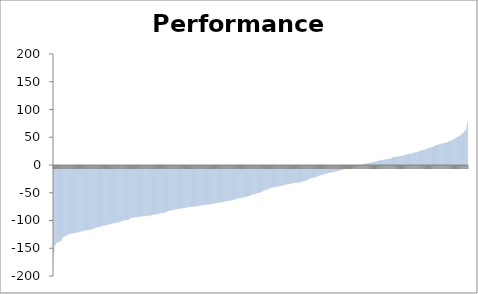
| Category | Series 0 |
|---|---|
| 0 | -168.15 |
| 1 | -160.46 |
| 2 | -155.47 |
| 3 | -143.4 |
| 4 | -143.14 |
| 5 | -141.38 |
| 6 | -139.07 |
| 7 | -138.73 |
| 8 | -138.63 |
| 9 | -137.36 |
| 10 | -137.06 |
| 11 | -136.82 |
| 12 | -136.69 |
| 13 | -136.4 |
| 14 | -136 |
| 15 | -135.44 |
| 16 | -135.12 |
| 17 | -134.83 |
| 18 | -132.09 |
| 19 | -130.36 |
| 20 | -128.58 |
| 21 | -127.94 |
| 22 | -127.71 |
| 23 | -126.86 |
| 24 | -126.47 |
| 25 | -126.25 |
| 26 | -126.04 |
| 27 | -126.02 |
| 28 | -125.87 |
| 29 | -124.94 |
| 30 | -124.08 |
| 31 | -123.94 |
| 32 | -123.57 |
| 33 | -123.02 |
| 34 | -122.91 |
| 35 | -122.63 |
| 36 | -122.16 |
| 37 | -121.8 |
| 38 | -121.59 |
| 39 | -121.44 |
| 40 | -121.37 |
| 41 | -121.22 |
| 42 | -121.2 |
| 43 | -120.97 |
| 44 | -120.97 |
| 45 | -120.63 |
| 46 | -120.4 |
| 47 | -120.26 |
| 48 | -120.23 |
| 49 | -120.15 |
| 50 | -120.1 |
| 51 | -119.71 |
| 52 | -119.6 |
| 53 | -119.43 |
| 54 | -118.8 |
| 55 | -118.68 |
| 56 | -118.65 |
| 57 | -118.44 |
| 58 | -117.842 |
| 59 | -117.803 |
| 60 | -117.276 |
| 61 | -117.073 |
| 62 | -116.786 |
| 63 | -116.783 |
| 64 | -116.707 |
| 65 | -116.63 |
| 66 | -116.42 |
| 67 | -116.2 |
| 68 | -115.933 |
| 69 | -115.901 |
| 70 | -115.684 |
| 71 | -115.58 |
| 72 | -115.505 |
| 73 | -115.445 |
| 74 | -115.298 |
| 75 | -115.17 |
| 76 | -115.164 |
| 77 | -115.008 |
| 78 | -114.646 |
| 79 | -114.292 |
| 80 | -113.9 |
| 81 | -113.631 |
| 82 | -113.506 |
| 83 | -113.43 |
| 84 | -113.367 |
| 85 | -112.374 |
| 86 | -112.258 |
| 87 | -111.667 |
| 88 | -111.441 |
| 89 | -111.295 |
| 90 | -110.928 |
| 91 | -110.468 |
| 92 | -110.248 |
| 93 | -109.985 |
| 94 | -109.842 |
| 95 | -109.805 |
| 96 | -109.729 |
| 97 | -109.666 |
| 98 | -109.417 |
| 99 | -109.144 |
| 100 | -109.133 |
| 101 | -108.337 |
| 102 | -108.227 |
| 103 | -107.854 |
| 104 | -107.708 |
| 105 | -107.654 |
| 106 | -107.433 |
| 107 | -107.264 |
| 108 | -107.154 |
| 109 | -107.019 |
| 110 | -106.724 |
| 111 | -106.695 |
| 112 | -106.487 |
| 113 | -106.293 |
| 114 | -106.106 |
| 115 | -105.837 |
| 116 | -105.499 |
| 117 | -105.41 |
| 118 | -104.634 |
| 119 | -104.589 |
| 120 | -104.248 |
| 121 | -103.812 |
| 122 | -103.695 |
| 123 | -103.661 |
| 124 | -103.56 |
| 125 | -103.149 |
| 126 | -103.015 |
| 127 | -102.837 |
| 128 | -102.768 |
| 129 | -102.489 |
| 130 | -102.411 |
| 131 | -102.207 |
| 132 | -102.129 |
| 133 | -101.96 |
| 134 | -101.728 |
| 135 | -101.667 |
| 136 | -101.62 |
| 137 | -101.399 |
| 138 | -101.102 |
| 139 | -100.771 |
| 140 | -100.026 |
| 141 | -99.728 |
| 142 | -99.296 |
| 143 | -98.812 |
| 144 | -98.296 |
| 145 | -98.181 |
| 146 | -98.106 |
| 147 | -98.096 |
| 148 | -97.937 |
| 149 | -97.617 |
| 150 | -97.559 |
| 151 | -97.526 |
| 152 | -97.494 |
| 153 | -97.491 |
| 154 | -97.384 |
| 155 | -97.214 |
| 156 | -96.724 |
| 157 | -96.627 |
| 158 | -95.519 |
| 159 | -95.359 |
| 160 | -94.016 |
| 161 | -94.006 |
| 162 | -93.853 |
| 163 | -93.569 |
| 164 | -93.518 |
| 165 | -93.495 |
| 166 | -93.329 |
| 167 | -93.256 |
| 168 | -92.522 |
| 169 | -92.416 |
| 170 | -92.293 |
| 171 | -92.244 |
| 172 | -92.238 |
| 173 | -92.218 |
| 174 | -92.201 |
| 175 | -92.141 |
| 176 | -91.907 |
| 177 | -91.823 |
| 178 | -91.556 |
| 179 | -91.353 |
| 180 | -91.072 |
| 181 | -91.043 |
| 182 | -90.926 |
| 183 | -90.847 |
| 184 | -90.778 |
| 185 | -90.748 |
| 186 | -90.663 |
| 187 | -90.654 |
| 188 | -90.622 |
| 189 | -90.59 |
| 190 | -90.543 |
| 191 | -90.508 |
| 192 | -90.424 |
| 193 | -90.404 |
| 194 | -90.042 |
| 195 | -90.012 |
| 196 | -90.002 |
| 197 | -89.979 |
| 198 | -89.745 |
| 199 | -89.364 |
| 200 | -89.326 |
| 201 | -89.305 |
| 202 | -89.022 |
| 203 | -88.984 |
| 204 | -88.694 |
| 205 | -88.381 |
| 206 | -88.224 |
| 207 | -87.525 |
| 208 | -87.445 |
| 209 | -87.319 |
| 210 | -87.305 |
| 211 | -87.276 |
| 212 | -87.248 |
| 213 | -86.999 |
| 214 | -86.818 |
| 215 | -86.799 |
| 216 | -86.791 |
| 217 | -86.336 |
| 218 | -86.166 |
| 219 | -86.036 |
| 220 | -85.829 |
| 221 | -85.639 |
| 222 | -85.143 |
| 223 | -85.008 |
| 224 | -84.954 |
| 225 | -84.91 |
| 226 | -84.842 |
| 227 | -84.477 |
| 228 | -84.025 |
| 229 | -84.009 |
| 230 | -84.005 |
| 231 | -83.899 |
| 232 | -83.589 |
| 233 | -83.37 |
| 234 | -83.349 |
| 235 | -82.879 |
| 236 | -82.656 |
| 237 | -81.383 |
| 238 | -80.962 |
| 239 | -80.958 |
| 240 | -80.918 |
| 241 | -80.805 |
| 242 | -80.318 |
| 243 | -80.21 |
| 244 | -80.174 |
| 245 | -79.957 |
| 246 | -79.953 |
| 247 | -79.624 |
| 248 | -79.408 |
| 249 | -79.187 |
| 250 | -78.904 |
| 251 | -78.765 |
| 252 | -78.404 |
| 253 | -77.974 |
| 254 | -77.812 |
| 255 | -77.729 |
| 256 | -77.718 |
| 257 | -77.644 |
| 258 | -77.555 |
| 259 | -77.455 |
| 260 | -76.984 |
| 261 | -76.866 |
| 262 | -76.842 |
| 263 | -76.786 |
| 264 | -76.711 |
| 265 | -76.7 |
| 266 | -76.465 |
| 267 | -76.403 |
| 268 | -76.349 |
| 269 | -76.255 |
| 270 | -76.252 |
| 271 | -75.987 |
| 272 | -75.934 |
| 273 | -75.67 |
| 274 | -75.504 |
| 275 | -75.433 |
| 276 | -75.36 |
| 277 | -75.256 |
| 278 | -74.908 |
| 279 | -74.374 |
| 280 | -74.099 |
| 281 | -73.893 |
| 282 | -73.717 |
| 283 | -73.631 |
| 284 | -73.575 |
| 285 | -73.498 |
| 286 | -73.434 |
| 287 | -73.417 |
| 288 | -73.36 |
| 289 | -73.347 |
| 290 | -73.332 |
| 291 | -73.286 |
| 292 | -73.123 |
| 293 | -73.039 |
| 294 | -72.846 |
| 295 | -72.772 |
| 296 | -72.755 |
| 297 | -72.58 |
| 298 | -72.471 |
| 299 | -72.366 |
| 300 | -72.245 |
| 301 | -72.019 |
| 302 | -71.576 |
| 303 | -71.508 |
| 304 | -71.374 |
| 305 | -71.171 |
| 306 | -71.114 |
| 307 | -71.032 |
| 308 | -70.968 |
| 309 | -70.796 |
| 310 | -70.629 |
| 311 | -70.524 |
| 312 | -70.484 |
| 313 | -70.482 |
| 314 | -70.36 |
| 315 | -70.227 |
| 316 | -70.157 |
| 317 | -69.881 |
| 318 | -69.85 |
| 319 | -69.531 |
| 320 | -69.518 |
| 321 | -69.484 |
| 322 | -69.407 |
| 323 | -69.276 |
| 324 | -69.242 |
| 325 | -69.117 |
| 326 | -68.779 |
| 327 | -68.749 |
| 328 | -68.597 |
| 329 | -68.329 |
| 330 | -68.271 |
| 331 | -67.921 |
| 332 | -67.793 |
| 333 | -67.651 |
| 334 | -67.558 |
| 335 | -67.539 |
| 336 | -67.178 |
| 337 | -67.095 |
| 338 | -66.779 |
| 339 | -66.712 |
| 340 | -66.606 |
| 341 | -66.592 |
| 342 | -66.585 |
| 343 | -66.553 |
| 344 | -66.087 |
| 345 | -65.893 |
| 346 | -65.796 |
| 347 | -65.467 |
| 348 | -65.458 |
| 349 | -65.418 |
| 350 | -65.367 |
| 351 | -65.124 |
| 352 | -65.065 |
| 353 | -64.886 |
| 354 | -64.738 |
| 355 | -64.606 |
| 356 | -63.924 |
| 357 | -63.849 |
| 358 | -63.397 |
| 359 | -63.308 |
| 360 | -63.237 |
| 361 | -63.177 |
| 362 | -63.043 |
| 363 | -63.033 |
| 364 | -62.997 |
| 365 | -62.778 |
| 366 | -62.631 |
| 367 | -62.579 |
| 368 | -62.092 |
| 369 | -61.978 |
| 370 | -61.911 |
| 371 | -61.589 |
| 372 | -61.292 |
| 373 | -61.099 |
| 374 | -60.92 |
| 375 | -60.825 |
| 376 | -60.333 |
| 377 | -60.063 |
| 378 | -60.045 |
| 379 | -59.465 |
| 380 | -59.254 |
| 381 | -59.107 |
| 382 | -59.046 |
| 383 | -59.011 |
| 384 | -58.656 |
| 385 | -58.201 |
| 386 | -57.795 |
| 387 | -57.795 |
| 388 | -57.7 |
| 389 | -57.683 |
| 390 | -57.441 |
| 391 | -57.266 |
| 392 | -56.864 |
| 393 | -56.656 |
| 394 | -56.57 |
| 395 | -56.389 |
| 396 | -56.377 |
| 397 | -56.099 |
| 398 | -55.764 |
| 399 | -55.722 |
| 400 | -55.631 |
| 401 | -55.245 |
| 402 | -55.178 |
| 403 | -55.085 |
| 404 | -54.661 |
| 405 | -54.572 |
| 406 | -54.012 |
| 407 | -53.901 |
| 408 | -53.774 |
| 409 | -53.722 |
| 410 | -53.373 |
| 411 | -52.747 |
| 412 | -52.303 |
| 413 | -51.901 |
| 414 | -51.386 |
| 415 | -51.322 |
| 416 | -51.166 |
| 417 | -51.136 |
| 418 | -51.028 |
| 419 | -50.97 |
| 420 | -50.113 |
| 421 | -49.487 |
| 422 | -49.386 |
| 423 | -49.212 |
| 424 | -49.136 |
| 425 | -48.842 |
| 426 | -48.84 |
| 427 | -48.71 |
| 428 | -48.376 |
| 429 | -47.731 |
| 430 | -47.526 |
| 431 | -47.245 |
| 432 | -46.739 |
| 433 | -46.58 |
| 434 | -45.803 |
| 435 | -44.786 |
| 436 | -44.703 |
| 437 | -44.518 |
| 438 | -44.188 |
| 439 | -44.122 |
| 440 | -43.644 |
| 441 | -43.266 |
| 442 | -43.114 |
| 443 | -42.195 |
| 444 | -42.143 |
| 445 | -41.948 |
| 446 | -41.683 |
| 447 | -41.122 |
| 448 | -40.917 |
| 449 | -40.84 |
| 450 | -40.799 |
| 451 | -39.203 |
| 452 | -38.88 |
| 453 | -38.864 |
| 454 | -38.766 |
| 455 | -38.758 |
| 456 | -38.715 |
| 457 | -38.454 |
| 458 | -38.406 |
| 459 | -38.279 |
| 460 | -38.126 |
| 461 | -37.616 |
| 462 | -37.413 |
| 463 | -37.352 |
| 464 | -37.227 |
| 465 | -37.065 |
| 466 | -36.954 |
| 467 | -36.953 |
| 468 | -36.643 |
| 469 | -36.431 |
| 470 | -36.364 |
| 471 | -36.15 |
| 472 | -35.957 |
| 473 | -35.954 |
| 474 | -35.756 |
| 475 | -35.408 |
| 476 | -35.146 |
| 477 | -35.029 |
| 478 | -34.649 |
| 479 | -34.536 |
| 480 | -34.477 |
| 481 | -33.964 |
| 482 | -33.492 |
| 483 | -33.289 |
| 484 | -33.198 |
| 485 | -33.049 |
| 486 | -33.008 |
| 487 | -32.958 |
| 488 | -32.7 |
| 489 | -32.366 |
| 490 | -32.214 |
| 491 | -32.104 |
| 492 | -32.079 |
| 493 | -32.052 |
| 494 | -31.595 |
| 495 | -31.555 |
| 496 | -31.372 |
| 497 | -30.928 |
| 498 | -30.908 |
| 499 | -30.89 |
| 500 | -30.603 |
| 501 | -30.521 |
| 502 | -30.444 |
| 503 | -30.407 |
| 504 | -30.325 |
| 505 | -30.15 |
| 506 | -30.018 |
| 507 | -30.001 |
| 508 | -29.769 |
| 509 | -29.748 |
| 510 | -29.623 |
| 511 | -29.57 |
| 512 | -29.447 |
| 513 | -29.322 |
| 514 | -28.798 |
| 515 | -28.589 |
| 516 | -28.441 |
| 517 | -27.938 |
| 518 | -27.498 |
| 519 | -27.436 |
| 520 | -27.374 |
| 521 | -27.042 |
| 522 | -26.806 |
| 523 | -26.372 |
| 524 | -26.36 |
| 525 | -26.217 |
| 526 | -25.525 |
| 527 | -25.382 |
| 528 | -25.113 |
| 529 | -24.825 |
| 530 | -24.465 |
| 531 | -23.887 |
| 532 | -22.974 |
| 533 | -22.498 |
| 534 | -22.174 |
| 535 | -22.137 |
| 536 | -22.052 |
| 537 | -22.001 |
| 538 | -21.39 |
| 539 | -21.38 |
| 540 | -21.205 |
| 541 | -21.066 |
| 542 | -20.766 |
| 543 | -20.765 |
| 544 | -20.694 |
| 545 | -20.214 |
| 546 | -19.56 |
| 547 | -19.299 |
| 548 | -18.92 |
| 549 | -18.747 |
| 550 | -18.248 |
| 551 | -18.193 |
| 552 | -17.901 |
| 553 | -17.292 |
| 554 | -17.136 |
| 555 | -16.796 |
| 556 | -16.241 |
| 557 | -15.996 |
| 558 | -15.758 |
| 559 | -15.708 |
| 560 | -15.6 |
| 561 | -15.016 |
| 562 | -14.981 |
| 563 | -14.694 |
| 564 | -13.96 |
| 565 | -13.43 |
| 566 | -13.363 |
| 567 | -13.352 |
| 568 | -13.322 |
| 569 | -13.041 |
| 570 | -12.924 |
| 571 | -12.454 |
| 572 | -11.967 |
| 573 | -11.948 |
| 574 | -11.85 |
| 575 | -11.792 |
| 576 | -11.684 |
| 577 | -11.68 |
| 578 | -11.346 |
| 579 | -11.275 |
| 580 | -11.194 |
| 581 | -10.853 |
| 582 | -10.629 |
| 583 | -10.589 |
| 584 | -10.478 |
| 585 | -10.384 |
| 586 | -10.042 |
| 587 | -9.938 |
| 588 | -9.617 |
| 589 | -9.2 |
| 590 | -9.093 |
| 591 | -9.069 |
| 592 | -9.068 |
| 593 | -8.808 |
| 594 | -8.002 |
| 595 | -7.7 |
| 596 | -7.266 |
| 597 | -7.242 |
| 598 | -7.104 |
| 599 | -6.592 |
| 600 | -6.498 |
| 601 | -6.36 |
| 602 | -6.326 |
| 603 | -6.215 |
| 604 | -5.839 |
| 605 | -5.156 |
| 606 | -4.938 |
| 607 | -4.494 |
| 608 | -4.492 |
| 609 | -4.376 |
| 610 | -4.345 |
| 611 | -4.249 |
| 612 | -4.178 |
| 613 | -4.099 |
| 614 | -4.097 |
| 615 | -3.867 |
| 616 | -3.774 |
| 617 | -3.683 |
| 618 | -3.643 |
| 619 | -3.641 |
| 620 | -3.379 |
| 621 | -3.289 |
| 622 | -3.058 |
| 623 | -2.764 |
| 624 | -2.629 |
| 625 | -2.204 |
| 626 | -2.089 |
| 627 | -2.045 |
| 628 | -2.001 |
| 629 | -1.722 |
| 630 | -1.593 |
| 631 | -1.468 |
| 632 | -1.238 |
| 633 | -0.978 |
| 634 | -0.951 |
| 635 | -0.502 |
| 636 | -0.471 |
| 637 | -0.183 |
| 638 | -0.005 |
| 639 | 0.113 |
| 640 | 0.324 |
| 641 | 0.728 |
| 642 | 1.018 |
| 643 | 1.148 |
| 644 | 1.461 |
| 645 | 2.029 |
| 646 | 2.096 |
| 647 | 2.289 |
| 648 | 2.465 |
| 649 | 2.548 |
| 650 | 2.749 |
| 651 | 2.996 |
| 652 | 3.07 |
| 653 | 3.302 |
| 654 | 3.322 |
| 655 | 3.597 |
| 656 | 3.665 |
| 657 | 3.776 |
| 658 | 3.918 |
| 659 | 4.154 |
| 660 | 4.665 |
| 661 | 4.67 |
| 662 | 4.775 |
| 663 | 5.079 |
| 664 | 5.084 |
| 665 | 5.184 |
| 666 | 5.674 |
| 667 | 5.89 |
| 668 | 5.951 |
| 669 | 6.245 |
| 670 | 6.323 |
| 671 | 6.745 |
| 672 | 7.302 |
| 673 | 7.474 |
| 674 | 7.592 |
| 675 | 7.688 |
| 676 | 7.744 |
| 677 | 7.769 |
| 678 | 8.128 |
| 679 | 8.539 |
| 680 | 8.63 |
| 681 | 8.664 |
| 682 | 8.786 |
| 683 | 9.012 |
| 684 | 9.083 |
| 685 | 9.295 |
| 686 | 9.772 |
| 687 | 10.04 |
| 688 | 10.077 |
| 689 | 10.19 |
| 690 | 10.197 |
| 691 | 10.286 |
| 692 | 10.474 |
| 693 | 10.499 |
| 694 | 10.53 |
| 695 | 10.824 |
| 696 | 11.005 |
| 697 | 11.29 |
| 698 | 11.646 |
| 699 | 11.771 |
| 700 | 12.263 |
| 701 | 12.268 |
| 702 | 12.305 |
| 703 | 13.255 |
| 704 | 13.34 |
| 705 | 13.89 |
| 706 | 14.141 |
| 707 | 14.161 |
| 708 | 14.246 |
| 709 | 14.353 |
| 710 | 14.435 |
| 711 | 14.567 |
| 712 | 14.57 |
| 713 | 14.58 |
| 714 | 14.812 |
| 715 | 15.226 |
| 716 | 15.319 |
| 717 | 15.63 |
| 718 | 15.782 |
| 719 | 15.982 |
| 720 | 16.097 |
| 721 | 16.121 |
| 722 | 16.148 |
| 723 | 16.503 |
| 724 | 16.766 |
| 725 | 16.785 |
| 726 | 17.285 |
| 727 | 17.573 |
| 728 | 17.798 |
| 729 | 17.809 |
| 730 | 18.283 |
| 731 | 18.641 |
| 732 | 19.001 |
| 733 | 19.052 |
| 734 | 19.252 |
| 735 | 19.255 |
| 736 | 19.726 |
| 737 | 19.726 |
| 738 | 19.854 |
| 739 | 19.964 |
| 740 | 20.229 |
| 741 | 20.295 |
| 742 | 20.812 |
| 743 | 20.925 |
| 744 | 20.964 |
| 745 | 20.976 |
| 746 | 21.059 |
| 747 | 21.508 |
| 748 | 22.543 |
| 749 | 22.597 |
| 750 | 22.681 |
| 751 | 22.817 |
| 752 | 23.07 |
| 753 | 23.103 |
| 754 | 23.13 |
| 755 | 23.151 |
| 756 | 23.705 |
| 757 | 24.192 |
| 758 | 24.482 |
| 759 | 24.751 |
| 760 | 24.802 |
| 761 | 25.677 |
| 762 | 26.234 |
| 763 | 26.319 |
| 764 | 26.521 |
| 765 | 26.87 |
| 766 | 26.957 |
| 767 | 27.073 |
| 768 | 27.252 |
| 769 | 27.255 |
| 770 | 27.448 |
| 771 | 27.638 |
| 772 | 27.964 |
| 773 | 28.53 |
| 774 | 29.063 |
| 775 | 29.155 |
| 776 | 30.022 |
| 777 | 30.241 |
| 778 | 30.278 |
| 779 | 30.579 |
| 780 | 31.396 |
| 781 | 31.589 |
| 782 | 31.611 |
| 783 | 31.775 |
| 784 | 31.91 |
| 785 | 32.022 |
| 786 | 32.408 |
| 787 | 32.521 |
| 788 | 32.952 |
| 789 | 33.457 |
| 790 | 33.607 |
| 791 | 34.735 |
| 792 | 34.905 |
| 793 | 35.739 |
| 794 | 35.793 |
| 795 | 35.92 |
| 796 | 36.019 |
| 797 | 36.03 |
| 798 | 36.4 |
| 799 | 37.076 |
| 800 | 37.18 |
| 801 | 37.299 |
| 802 | 37.452 |
| 803 | 37.688 |
| 804 | 38.351 |
| 805 | 38.664 |
| 806 | 38.758 |
| 807 | 38.901 |
| 808 | 39.347 |
| 809 | 39.405 |
| 810 | 39.451 |
| 811 | 39.604 |
| 812 | 39.677 |
| 813 | 39.888 |
| 814 | 40.251 |
| 815 | 40.684 |
| 816 | 41.201 |
| 817 | 41.329 |
| 818 | 41.448 |
| 819 | 41.796 |
| 820 | 42.181 |
| 821 | 42.217 |
| 822 | 42.775 |
| 823 | 42.815 |
| 824 | 43.013 |
| 825 | 43.28 |
| 826 | 44.305 |
| 827 | 44.763 |
| 828 | 44.88 |
| 829 | 45.363 |
| 830 | 45.521 |
| 831 | 46.3 |
| 832 | 46.702 |
| 833 | 47.786 |
| 834 | 48.623 |
| 835 | 48.641 |
| 836 | 48.986 |
| 837 | 50.445 |
| 838 | 50.526 |
| 839 | 51.498 |
| 840 | 51.57 |
| 841 | 51.745 |
| 842 | 51.913 |
| 843 | 52.319 |
| 844 | 52.359 |
| 845 | 54.08 |
| 846 | 54.374 |
| 847 | 54.867 |
| 848 | 56.226 |
| 849 | 57.258 |
| 850 | 57.722 |
| 851 | 58.046 |
| 852 | 58.226 |
| 853 | 60.177 |
| 854 | 60.861 |
| 855 | 61.738 |
| 856 | 63.405 |
| 857 | 63.523 |
| 858 | 68.255 |
| 859 | 75.422 |
| 860 | 77.955 |